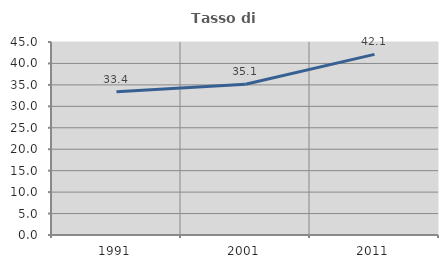
| Category | Tasso di occupazione   |
|---|---|
| 1991.0 | 33.41 |
| 2001.0 | 35.149 |
| 2011.0 | 42.119 |